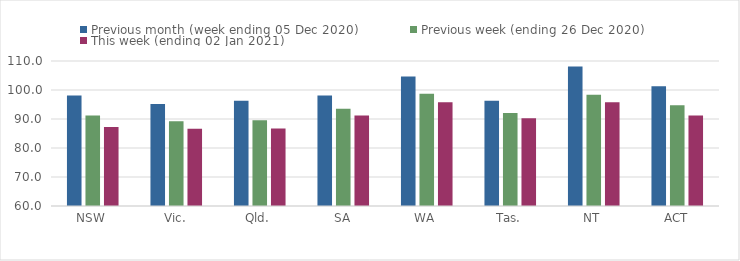
| Category | Previous month (week ending 05 Dec 2020) | Previous week (ending 26 Dec 2020) | This week (ending 02 Jan 2021) |
|---|---|---|---|
| NSW | 98.1 | 91.2 | 87.22 |
| Vic. | 95.17 | 89.19 | 86.64 |
| Qld. | 96.29 | 89.6 | 86.73 |
| SA | 98.09 | 93.53 | 91.24 |
| WA | 104.62 | 98.73 | 95.74 |
| Tas. | 96.31 | 92.04 | 90.29 |
| NT | 108.07 | 98.35 | 95.75 |
| ACT | 101.27 | 94.75 | 91.21 |